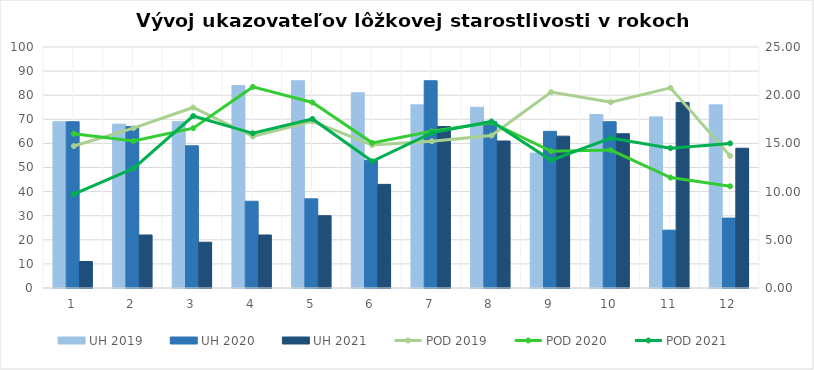
| Category | UH 2019 | UH 2020 | UH 2021 |
|---|---|---|---|
| 0 | 69 | 69 | 11 |
| 1 | 68 | 67 | 22 |
| 2 | 69 | 59 | 19 |
| 3 | 84 | 36 | 22 |
| 4 | 86 | 37 | 30 |
| 5 | 81 | 53 | 43 |
| 6 | 76 | 86 | 67 |
| 7 | 75 | 69 | 61 |
| 8 | 56 | 65 | 63 |
| 9 | 72 | 69 | 64 |
| 10 | 71 | 24 | 77 |
| 11 | 76 | 29 | 58 |